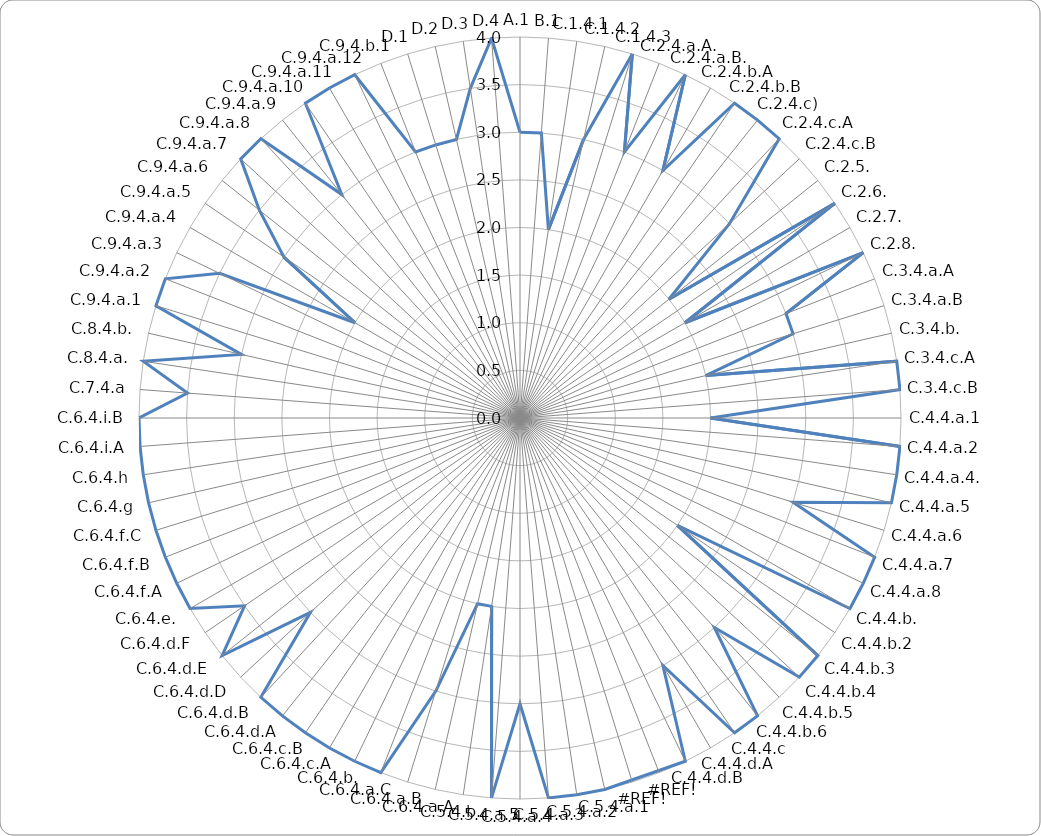
| Category | Series 0 |
|---|---|
| A.1 | 3 |
| B.1 | 3 |
| C.1.4.1 | 2 |
| C.1.4.2 | 3 |
| C.1.4.3 | 4 |
| C.2.4.a.A. | 3 |
| C.2.4.a.B. | 4 |
| C.2.4.b.A | 3 |
| C.2.4.b.B | 4 |
| C.2.4.c)  | 4 |
| C.2.4.c.A | 4 |
| C.2.4.c.B | 3 |
| C.2.5. | 2 |
| C.2.6. | 4 |
| C.2.7. | 2 |
| C.2.8. | 4 |
| C.3.4.a.A | 3 |
| C.3.4.a.B | 3 |
| C.3.4.b. | 2 |
| C.3.4.c.A | 4 |
| C.3.4.c.B | 4 |
| C.4.4.a.1 | 2 |
| C.4.4.a.2 | 4 |
| C.4.4.a.4. | 4 |
| C.4.4.a.5 | 4 |
| C.4.4.a.6 | 3 |
| C.4.4.a.7 | 4 |
| C.4.4.a.8 | 4 |
| C.4.4.b. | 4 |
| C.4.4.b.2 | 2 |
| C.4.4.b.3 | 4 |
| C.4.4.b.4 | 4 |
| C.4.4.b.5 | 3 |
| C.4.4.b.6 | 4 |
| C.4.4.c | 4 |
| C.4.4.d.A | 3 |
| C.4.4.d.B | 4 |
| #REF! | 0 |
| #REF! | 0 |
| C.5.4.a.1 | 4 |
| C.5.4.a.2 | 4 |
| C.5.4.a.3 | 4 |
| C.5.4.a.4 | 3 |
| C.5.4.a.5 | 4 |
| C.5.4.b. | 2 |
| C.6.4.a.A | 2 |
| C.6.4.a.B | 3 |
| C.6.4.a.C | 4 |
| C.6.4.b. | 4 |
| C.6.4.c.A | 4 |
| C.6.4.c.B | 4 |
| C.6.4.d.A | 4 |
| C.6.4.d.B | 4 |
| C.6.4.d.D | 3 |
| C.6.4.d.E | 4 |
| C.6.4.d.F | 3.5 |
| C.6.4.e. | 4 |
| C.6.4.f.A | 4 |
| C.6.4.f.B | 4 |
| C.6.4.f.C | 4 |
| C.6.4.g | 4 |
| C.6.4.h | 4 |
| C.6.4.i.A | 4 |
| C.6.4.i.B | 4 |
| C.7.4.a | 3.5 |
| C.8.4.a. | 4 |
| C.8.4.b. | 3 |
| C.9.4.a.1 | 4 |
| C.9.4.a.2 | 4 |
| C.9.4.a.3 | 3.5 |
| C.9.4.a.4 | 2 |
| C.9.4.a.5 | 3 |
| C.9.4.a.6 | 3.5 |
| C.9.4.a.7 | 4 |
| C.9.4.a.8 | 4 |
| C.9.4.a.9 | 3 |
| C.9.4.a.10 | 4 |
| C.9.4.a.11 | 4 |
| C.9.4.a.12 | 4 |
| C.9.4.b.1 | 3 |
| D.1 | 3 |
| D.2 | 3 |
| D.3 | 3.5 |
| D.4 | 4 |